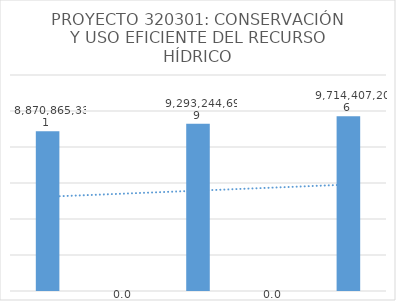
| Category | Series 0 |
|---|---|
| 0 | 8870865331 |
| 1 | 0.048 |
| 2 | 9293244699 |
| 3 | 0.045 |
| 4 | 9714407205.644 |